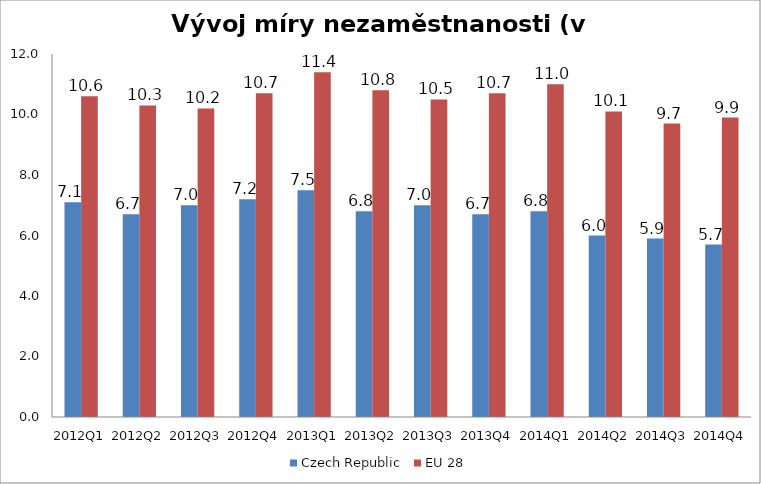
| Category | Czech Republic | EU 28 |
|---|---|---|
| 2012Q1 | 7.1 | 10.6 |
| 2012Q2 | 6.7 | 10.3 |
| 2012Q3 | 7 | 10.2 |
| 2012Q4 | 7.2 | 10.7 |
| 2013Q1 | 7.5 | 11.4 |
| 2013Q2 | 6.8 | 10.8 |
| 2013Q3 | 7 | 10.5 |
| 2013Q4 | 6.7 | 10.7 |
| 2014Q1 | 6.8 | 11 |
| 2014Q2 | 6 | 10.1 |
| 2014Q3 | 5.9 | 9.7 |
| 2014Q4 | 5.7 | 9.9 |